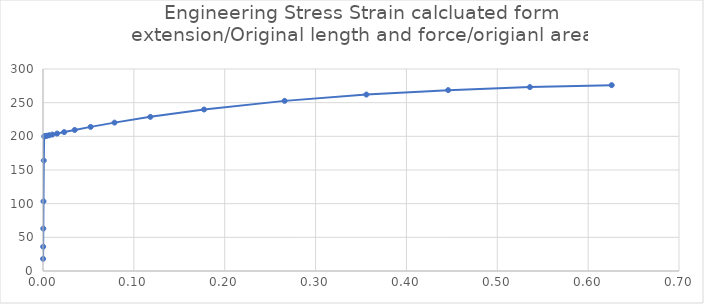
| Category | Series 0 |
|---|---|
| 9e-05 | 17.998 |
| 0.00018 | 35.993 |
| 0.000315 | 62.979 |
| 0.0005175 | 103.443 |
| 0.00082125 | 164.106 |
| 0.00127688 | 199.963 |
| 0.00196031 | 200.166 |
| 0.00298547 | 200.472 |
| 0.0045232 | 200.927 |
| 0.0068298 | 201.606 |
| 0.0102897 | 202.615 |
| 0.0154796 | 204.107 |
| 0.0232643 | 206.297 |
| 0.0349415 | 209.478 |
| 0.0524573 | 214.025 |
| 0.0787309 | 220.371 |
| 0.118141 | 228.918 |
| 0.177257 | 239.828 |
| 0.265931 | 252.666 |
| 0.355931 | 262.03 |
| 0.445931 | 268.617 |
| 0.535931 | 273.103 |
| 0.625931 | 275.982 |